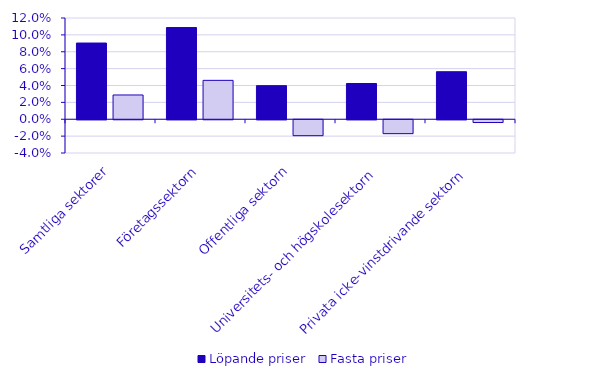
| Category | Löpande priser | Fasta priser |
|---|---|---|
| Samtliga sektorer | 0.09 | 0.029 |
| Företagssektorn | 0.109 | 0.046 |
| Offentliga sektorn | 0.04 | -0.019 |
| Universitets- och högskolesektorn | 0.042 | -0.016 |
| Privata icke-vinstdrivande sektorn | 0.056 | -0.003 |